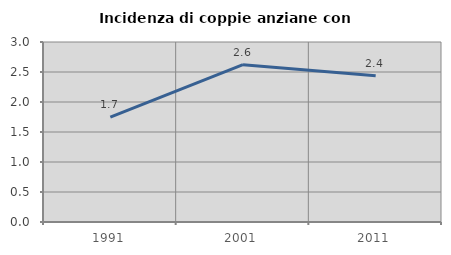
| Category | Incidenza di coppie anziane con figli |
|---|---|
| 1991.0 | 1.747 |
| 2001.0 | 2.623 |
| 2011.0 | 2.437 |